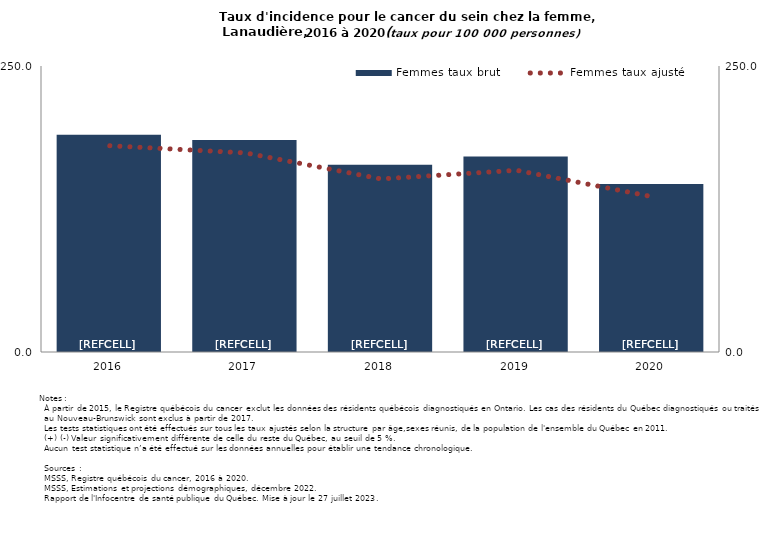
| Category | Femmes taux brut |
|---|---|
| 2016.0 | 189.874 |
| 2017.0 | 185.311 |
| 2018.0 | 163.771 |
| 2019.0 | 170.876 |
| 2020.0 | 146.932 |